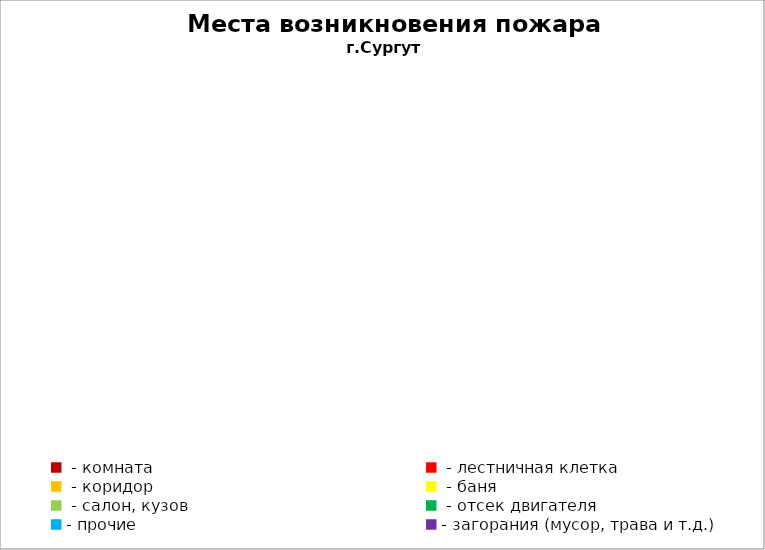
| Category | Места возникновения пожара |
|---|---|
|  - комната | 45 |
|  - лестничная клетка | 13 |
|  - коридор | 6 |
|  - баня | 18 |
|  - салон, кузов | 8 |
|  - отсек двигателя | 17 |
| - прочие | 75 |
| - загорания (мусор, трава и т.д.)  | 136 |